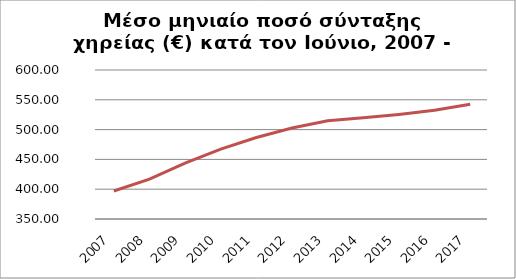
| Category | Series 1 |
|---|---|
| 2007.0 | 396.928 |
| 2008.0 | 416.865 |
| 2009.0 | 443.721 |
| 2010.0 | 467.367 |
| 2011.0 | 486.787 |
| 2012.0 | 502.695 |
| 2013.0 | 514.839 |
| 2014.0 | 519.7 |
| 2015.0 | 525.45 |
| 2016.0 | 532.34 |
| 2017.0 | 542.54 |